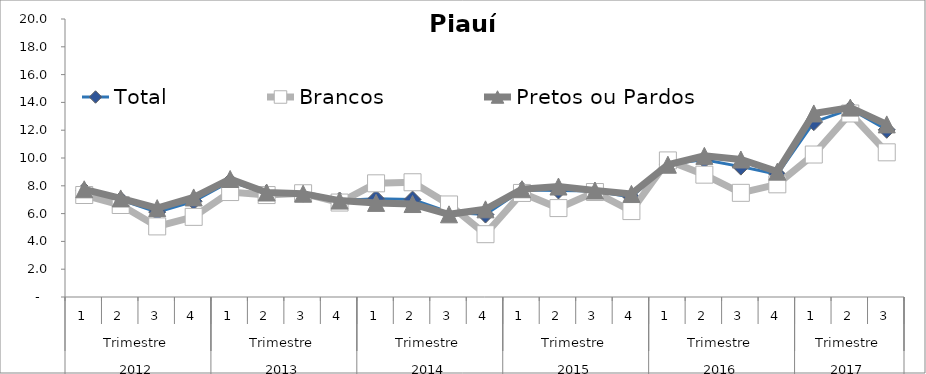
| Category | Total | Brancos | Pretos ou Pardos |
|---|---|---|---|
| 0 | 7.64 | 7.338 | 7.75 |
| 1 | 6.988 | 6.619 | 7.092 |
| 2 | 6.11 | 5.078 | 6.393 |
| 3 | 6.889 | 5.765 | 7.162 |
| 4 | 8.308 | 7.55 | 8.49 |
| 5 | 7.474 | 7.334 | 7.517 |
| 6 | 7.436 | 7.465 | 7.433 |
| 7 | 6.94 | 6.795 | 6.936 |
| 8 | 7.061 | 8.178 | 6.771 |
| 9 | 7.012 | 8.255 | 6.687 |
| 10 | 6.098 | 6.658 | 5.949 |
| 11 | 5.931 | 4.519 | 6.306 |
| 12 | 7.697 | 7.486 | 7.753 |
| 13 | 7.663 | 6.397 | 7.947 |
| 14 | 7.63 | 7.552 | 7.657 |
| 15 | 7.179 | 6.181 | 7.418 |
| 16 | 9.559 | 9.827 | 9.516 |
| 17 | 9.877 | 8.801 | 10.154 |
| 18 | 9.379 | 7.494 | 9.892 |
| 19 | 8.831 | 8.106 | 9.018 |
| 20 | 12.576 | 10.25 | 13.205 |
| 21 | 13.521 | 13.202 | 13.626 |
| 22 | 12.03 | 10.409 | 12.417 |